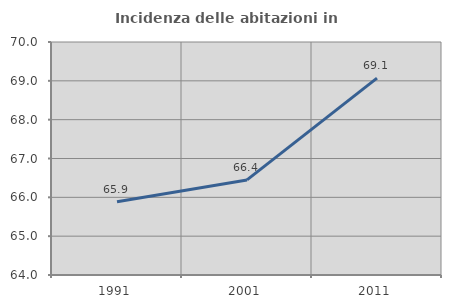
| Category | Incidenza delle abitazioni in proprietà  |
|---|---|
| 1991.0 | 65.886 |
| 2001.0 | 66.448 |
| 2011.0 | 69.07 |